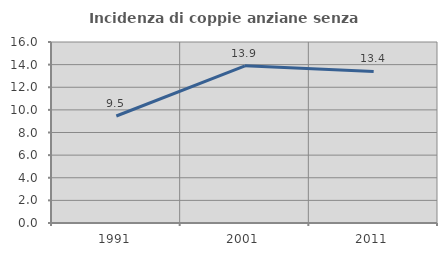
| Category | Incidenza di coppie anziane senza figli  |
|---|---|
| 1991.0 | 9.458 |
| 2001.0 | 13.897 |
| 2011.0 | 13.399 |